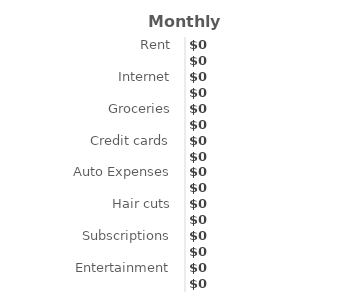
| Category | Amount |
|---|---|
| Rent | 0 |
| Utilities (electric, water, gas)  | 0 |
| Internet | 0 |
| Cell phone | 0 |
| Groceries | 0 |
| Student loans | 0 |
| Credit cards | 0 |
| Car Payment | 0 |
| Auto Expenses | 0 |
| Insurance | 0 |
| Hair cuts | 0 |
| Child Care | 0 |
| Subscriptions | 0 |
| Clothing | 0 |
| Entertainment | 0 |
| Miscellaneous | 0 |